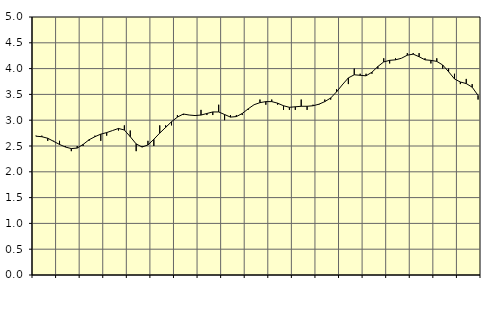
| Category | Piggar | Series 1 |
|---|---|---|
| nan | 2.7 | 2.69 |
| 1.0 | 2.7 | 2.68 |
| 1.0 | 2.6 | 2.65 |
| 1.0 | 2.6 | 2.59 |
| nan | 2.6 | 2.53 |
| 2.0 | 2.5 | 2.48 |
| 2.0 | 2.4 | 2.45 |
| 2.0 | 2.5 | 2.46 |
| nan | 2.5 | 2.53 |
| 3.0 | 2.6 | 2.62 |
| 3.0 | 2.7 | 2.68 |
| 3.0 | 2.6 | 2.73 |
| nan | 2.7 | 2.76 |
| 4.0 | 2.8 | 2.8 |
| 4.0 | 2.8 | 2.84 |
| 4.0 | 2.9 | 2.81 |
| nan | 2.8 | 2.68 |
| 5.0 | 2.4 | 2.54 |
| 5.0 | 2.5 | 2.48 |
| 5.0 | 2.6 | 2.52 |
| nan | 2.5 | 2.63 |
| 6.0 | 2.9 | 2.75 |
| 6.0 | 2.9 | 2.86 |
| 6.0 | 2.9 | 2.97 |
| nan | 3.1 | 3.06 |
| 7.0 | 3.1 | 3.12 |
| 7.0 | 3.1 | 3.1 |
| 7.0 | 3.1 | 3.09 |
| nan | 3.2 | 3.1 |
| 8.0 | 3.1 | 3.13 |
| 8.0 | 3.1 | 3.16 |
| 8.0 | 3.3 | 3.16 |
| nan | 3 | 3.11 |
| 9.0 | 3.1 | 3.06 |
| 9.0 | 3.1 | 3.07 |
| 9.0 | 3.1 | 3.13 |
| nan | 3.2 | 3.22 |
| 10.0 | 3.3 | 3.3 |
| 10.0 | 3.4 | 3.34 |
| 10.0 | 3.3 | 3.36 |
| nan | 3.4 | 3.36 |
| 11.0 | 3.3 | 3.33 |
| 11.0 | 3.2 | 3.28 |
| 11.0 | 3.2 | 3.25 |
| nan | 3.2 | 3.26 |
| 12.0 | 3.4 | 3.27 |
| 12.0 | 3.2 | 3.27 |
| 12.0 | 3.3 | 3.28 |
| nan | 3.3 | 3.31 |
| 13.0 | 3.4 | 3.36 |
| 13.0 | 3.4 | 3.43 |
| 13.0 | 3.6 | 3.55 |
| nan | 3.7 | 3.69 |
| 14.0 | 3.7 | 3.82 |
| 14.0 | 4 | 3.88 |
| 14.0 | 3.9 | 3.87 |
| nan | 3.9 | 3.86 |
| 15.0 | 3.9 | 3.93 |
| 15.0 | 4 | 4.04 |
| 15.0 | 4.2 | 4.13 |
| nan | 4.1 | 4.16 |
| 16.0 | 4.2 | 4.17 |
| 16.0 | 4.2 | 4.2 |
| 16.0 | 4.3 | 4.26 |
| nan | 4.3 | 4.28 |
| 17.0 | 4.3 | 4.23 |
| 17.0 | 4.2 | 4.17 |
| 17.0 | 4.1 | 4.16 |
| nan | 4.2 | 4.14 |
| 18.0 | 4 | 4.07 |
| 18.0 | 4 | 3.94 |
| 18.0 | 3.9 | 3.8 |
| nan | 3.7 | 3.74 |
| 19.0 | 3.8 | 3.71 |
| 19.0 | 3.7 | 3.64 |
| 19.0 | 3.4 | 3.48 |